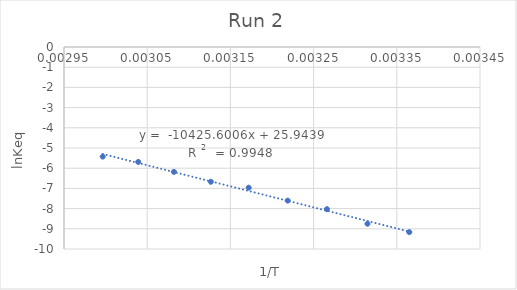
| Category | SIEt repeat-1 |
|---|---|
| 0.003364963994885255 | -9.164 |
| 0.003314770617873243 | -8.749 |
| 0.0032660526487686982 | -8.027 |
| 0.0032188495831589788 | -7.605 |
| 0.003171985028230667 | -6.963 |
| 0.0031264655307175235 | -6.671 |
| 0.0030821390044691015 | -6.183 |
| 0.0030392365437802026 | -5.69 |
| 0.002996524032122737 | -5.427 |